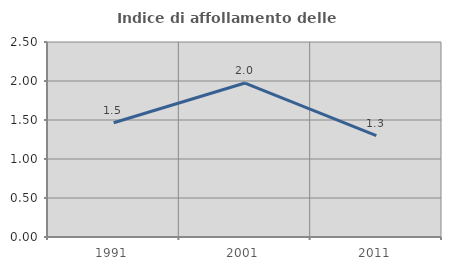
| Category | Indice di affollamento delle abitazioni  |
|---|---|
| 1991.0 | 1.465 |
| 2001.0 | 1.974 |
| 2011.0 | 1.299 |